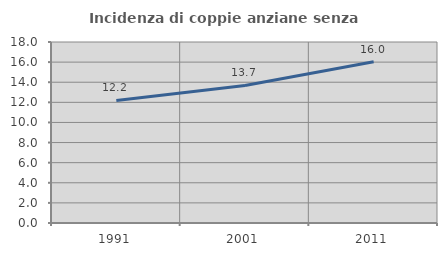
| Category | Incidenza di coppie anziane senza figli  |
|---|---|
| 1991.0 | 12.184 |
| 2001.0 | 13.68 |
| 2011.0 | 16.043 |